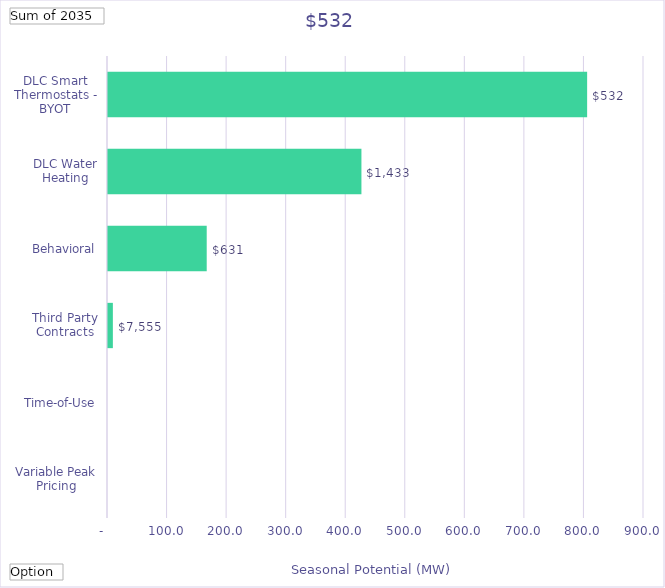
| Category | Winter Peak Reduction @Meter  (Therms) |
|---|---|
| Variable Peak Pricing | 0 |
| Time-of-Use | 0 |
| Third Party Contracts | 8.175 |
| Behavioral | 165.753 |
| DLC Water Heating | 425.538 |
| DLC Smart Thermostats - BYOT | 804.518 |